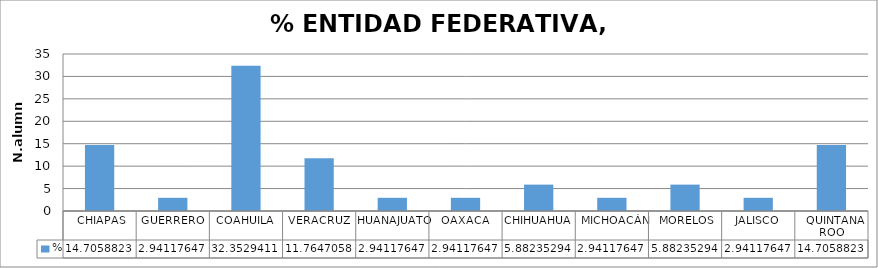
| Category | % |
|---|---|
|  CHIAPAS | 14.706 |
| GUERRERO | 2.941 |
| COAHUILA | 32.353 |
| VERACRUZ | 11.765 |
| HUANAJUATO | 2.941 |
| OAXACA | 2.941 |
| CHIHUAHUA | 5.882 |
|  MICHOACÁN | 2.941 |
|  MORELOS | 5.882 |
| JALISCO | 2.941 |
|  QUINTANA ROO | 14.706 |